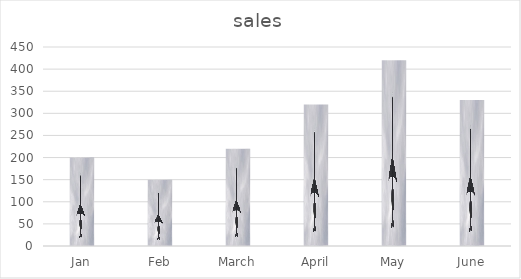
| Category | sales |
|---|---|
| Jan | 200 |
| Feb | 150 |
| March | 220 |
| April | 320 |
| May | 420 |
| June | 330 |